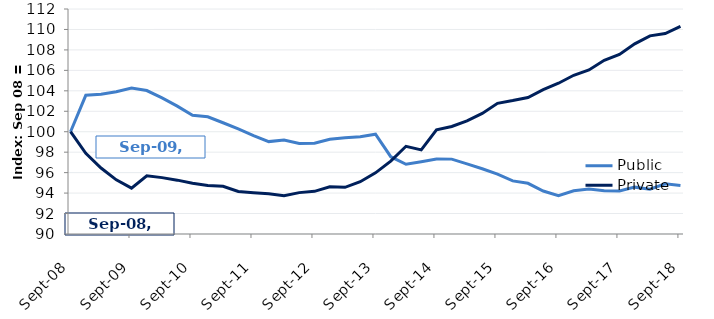
| Category | Public |
|---|---|
| 2008-09-01 | 100 |
| 2008-12-01 | 103.562 |
| 2009-03-01 | 103.655 |
| 2009-06-01 | 103.903 |
| 2009-09-01 | 104.264 |
| 2009-12-01 | 104.025 |
| 2010-03-01 | 103.303 |
| 2010-06-01 | 102.503 |
| 2010-09-01 | 101.602 |
| 2010-12-01 | 101.466 |
| 2011-03-01 | 100.878 |
| 2011-06-01 | 100.269 |
| 2011-09-01 | 99.621 |
| 2011-12-01 | 99.033 |
| 2012-03-01 | 99.188 |
| 2012-06-01 | 98.852 |
| 2012-09-01 | 98.885 |
| 2012-12-01 | 99.259 |
| 2013-03-01 | 99.409 |
| 2013-06-01 | 99.516 |
| 2013-09-01 | 99.756 |
| 2013-12-01 | 97.557 |
| 2014-03-01 | 96.819 |
| 2014-06-01 | 97.055 |
| 2014-09-01 | 97.325 |
| 2014-12-01 | 97.321 |
| 2015-03-01 | 96.861 |
| 2015-06-01 | 96.38 |
| 2015-09-01 | 95.848 |
| 2015-12-01 | 95.19 |
| 2016-03-01 | 94.956 |
| 2016-06-01 | 94.204 |
| 2016-09-01 | 93.755 |
| 2016-12-01 | 94.232 |
| 2017-03-01 | 94.393 |
| 2017-06-01 | 94.237 |
| 2017-09-01 | 94.213 |
| 2017-12-01 | 94.582 |
| 2018-03-01 | 94.389 |
| 2018-06-01 | 94.912 |
| 2018-09-01 | 94.743 |